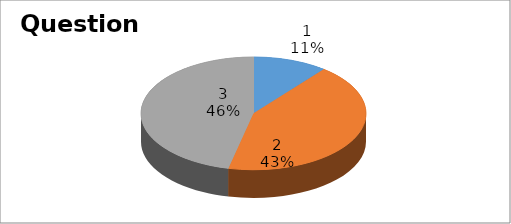
| Category | Series 0 |
|---|---|
| 0 | 6 |
| 1 | 24 |
| 2 | 26 |